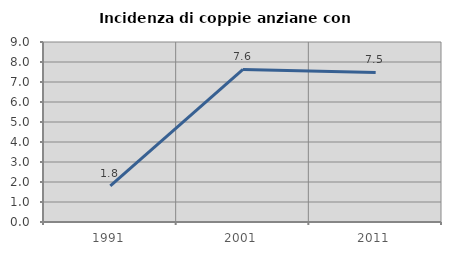
| Category | Incidenza di coppie anziane con figli |
|---|---|
| 1991.0 | 1.802 |
| 2001.0 | 7.627 |
| 2011.0 | 7.477 |